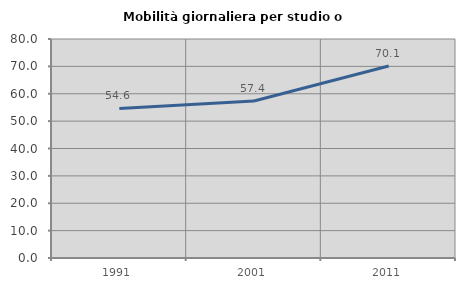
| Category | Mobilità giornaliera per studio o lavoro |
|---|---|
| 1991.0 | 54.625 |
| 2001.0 | 57.372 |
| 2011.0 | 70.138 |